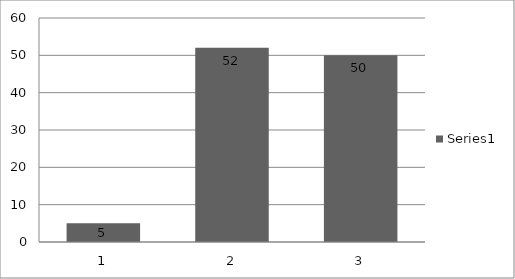
| Category | Series 0 |
|---|---|
| 1 | 5 |
| 2 | 52 |
| 3 | 50 |